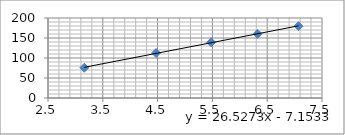
| Category | Series 0 |
|---|---|
| 3.1622776601683795 | 75.6 |
| 4.47213595499958 | 112.6 |
| 5.477225575051661 | 139.2 |
| 6.324555320336759 | 160.4 |
| 7.0710678118654755 | 179.6 |